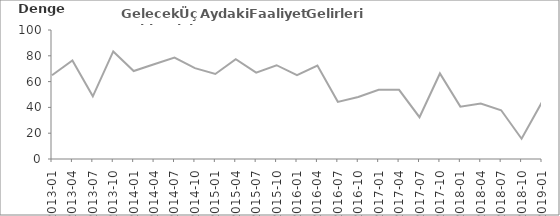
| Category | Gelecek Üç Aydaki Faaliyet Gelirleri Beklentisi |
|---|---|
| 2013-01 | 64.9 |
| 2013-04 | 76.4 |
| 2013-07 | 48.6 |
| 2013-10 | 83.4 |
| 2014-01 | 68.2 |
| 2014-04 | 73.4 |
| 2014-07 | 78.6 |
| 2014-10 | 70.4 |
| 2015-01 | 65.9 |
| 2015-04 | 77.4 |
| 2015-07 | 67 |
| 2015-10 | 72.7 |
| 2016-01 | 65 |
| 2016-04 | 72.4 |
| 2016-07 | 44.3 |
| 2016-10 | 48.1 |
| 2017-01 | 53.6 |
| 2017-04 | 53.6 |
| 2017-07 | 32.4 |
| 2017-10 | 66.3 |
| 2018-01 | 40.6 |
| 2018-04 | 43 |
| 2018-07 | 37.8 |
| 2018-10 | 15.7 |
| 2019-01 | 44.1 |